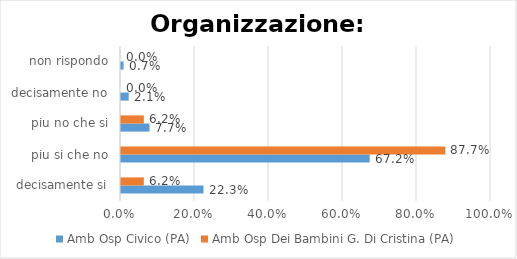
| Category | Amb Osp Civico (PA) | Amb Osp Dei Bambini G. Di Cristina (PA) |
|---|---|---|
| decisamente si | 0.223 | 0.062 |
| piu si che no | 0.672 | 0.877 |
| piu no che si | 0.077 | 0.062 |
| decisamente no | 0.021 | 0 |
| non rispondo | 0.007 | 0 |